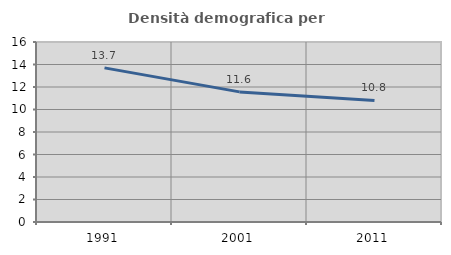
| Category | Densità demografica |
|---|---|
| 1991.0 | 13.7 |
| 2001.0 | 11.566 |
| 2011.0 | 10.808 |